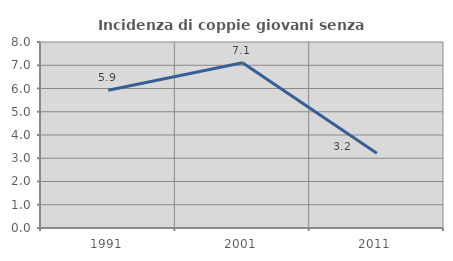
| Category | Incidenza di coppie giovani senza figli |
|---|---|
| 1991.0 | 5.921 |
| 2001.0 | 7.109 |
| 2011.0 | 3.212 |